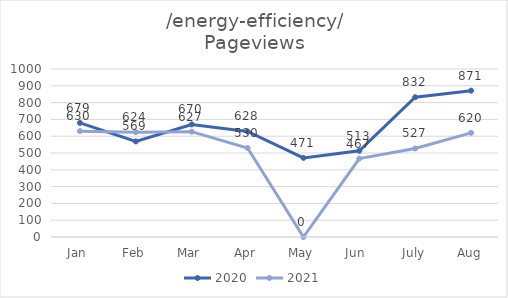
| Category | 2020 | 2021 |
|---|---|---|
| Jan | 679 | 630 |
| Feb | 569 | 624 |
| Mar | 670 | 627 |
| Apr | 628 | 530 |
| May | 471 | 0 |
| Jun  | 513 | 467 |
| July | 832 | 527 |
| Aug | 871 | 620 |